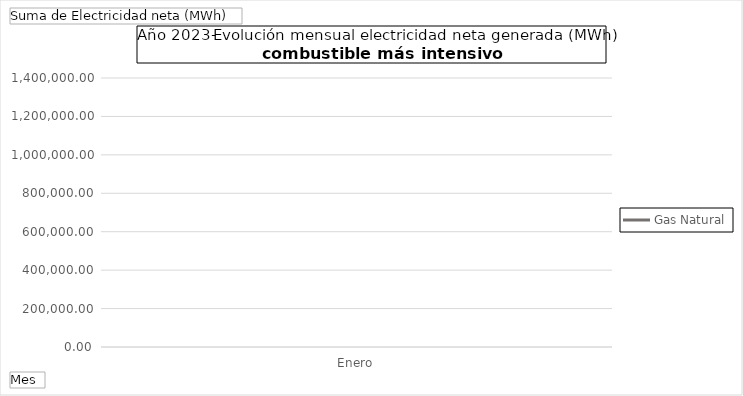
| Category | Gas Natural |
|---|---|
| Enero | 1269676.62 |